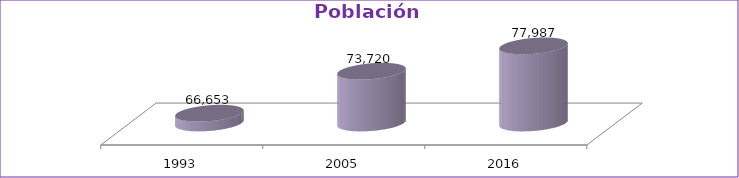
| Category | Población Total |
|---|---|
| 1993 | 66653 |
| 2005 | 73720 |
| 2016 | 77987 |